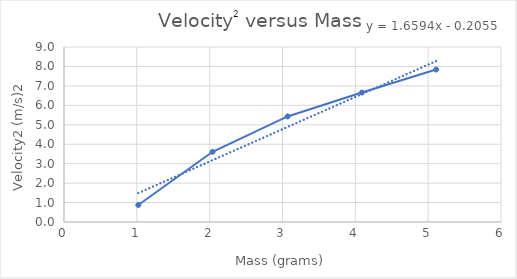
| Category | Series 0 |
|---|---|
| 1.02 | 0.876 |
| 2.04 | 3.61 |
| 3.07 | 5.429 |
| 4.09 | 6.656 |
| 5.11 | 7.84 |